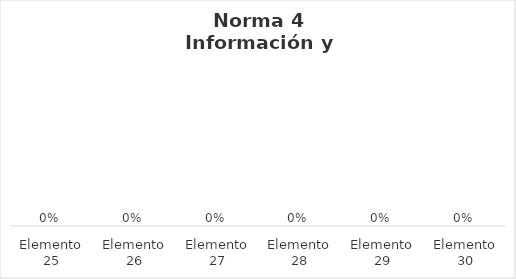
| Category | Series 0 |
|---|---|
| Elemento 25 | 0 |
| Elemento 26 | 0 |
| Elemento 27 | 0 |
| Elemento 28 | 0 |
| Elemento 29 | 0 |
| Elemento 30 | 0 |